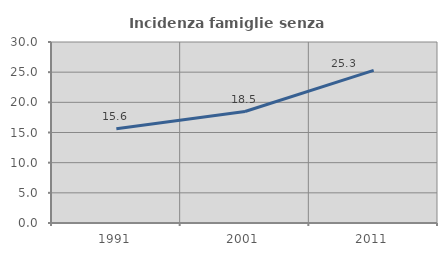
| Category | Incidenza famiglie senza nuclei |
|---|---|
| 1991.0 | 15.62 |
| 2001.0 | 18.474 |
| 2011.0 | 25.302 |